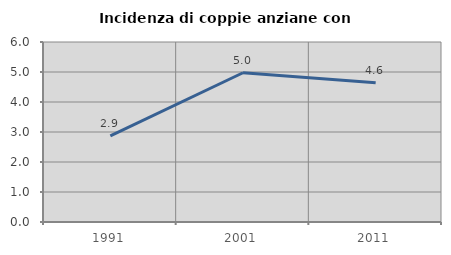
| Category | Incidenza di coppie anziane con figli |
|---|---|
| 1991.0 | 2.873 |
| 2001.0 | 4.975 |
| 2011.0 | 4.645 |